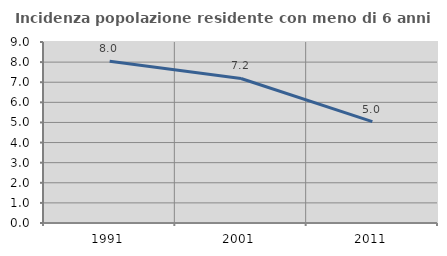
| Category | Incidenza popolazione residente con meno di 6 anni |
|---|---|
| 1991.0 | 8.04 |
| 2001.0 | 7.187 |
| 2011.0 | 5.037 |